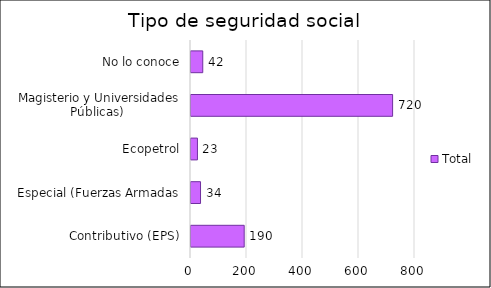
| Category | Total |
|---|---|
| Contributivo (EPS) | 190 |
| Especial (Fuerzas Armadas, Ecopetrol, Magisterio y Universidades Públicas) | 34 |
| No lo conoce | 23 |
| No responde | 720 |
| Subsidiado (EPS-S) | 42 |